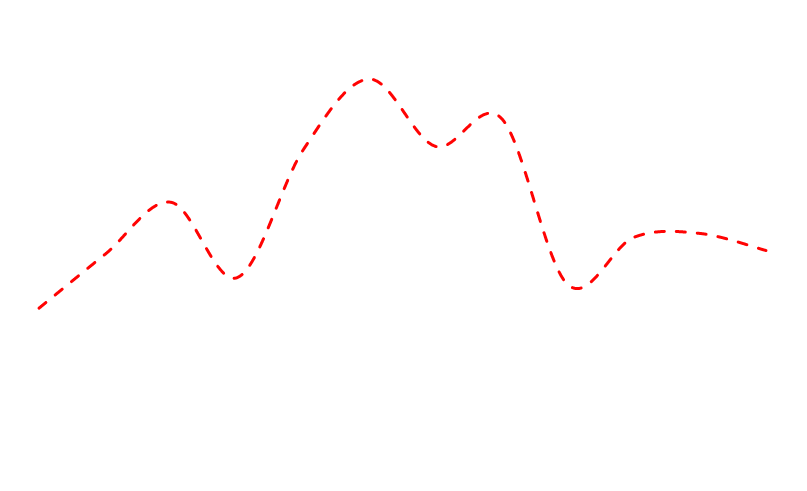
| Category | Series 0 |
|---|---|
| 0 | 23458.719 |
| 1 | 24252.704 |
| 2 | 25018.477 |
| 3 | 23908.736 |
| 4 | 25795.493 |
| 5 | 26834.71 |
| 6 | 25842.187 |
| 7 | 26253.007 |
| 8 | 23806.433 |
| 9 | 24502.534 |
| 10 | 24560.127 |
| 11 | 24308.237 |